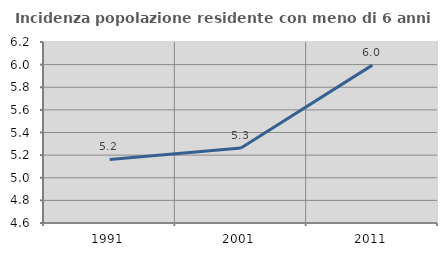
| Category | Incidenza popolazione residente con meno di 6 anni |
|---|---|
| 1991.0 | 5.162 |
| 2001.0 | 5.263 |
| 2011.0 | 5.996 |